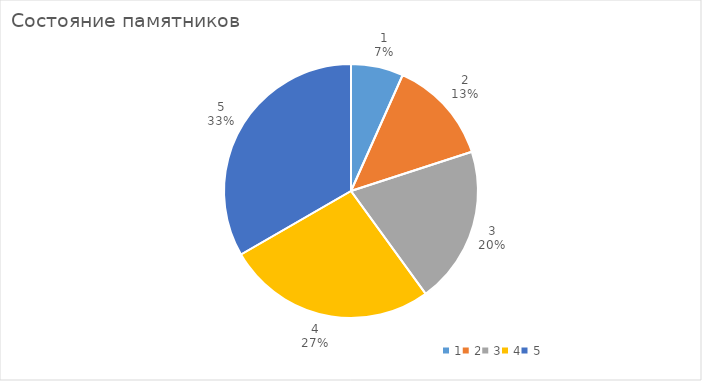
| Category | Series 0 | Series 1 |
|---|---|---|
| 0 | 1 | 1 |
| 1 | 2 | 6 |
| 2 | 3 | 50 |
| 3 | 4 | 190 |
| 4 | 5 | 254 |